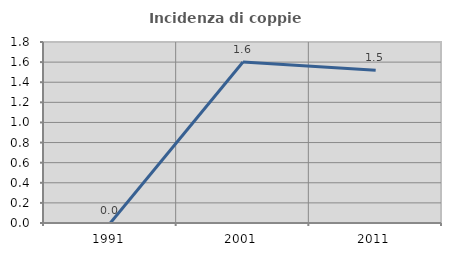
| Category | Incidenza di coppie miste |
|---|---|
| 1991.0 | 0 |
| 2001.0 | 1.602 |
| 2011.0 | 1.519 |